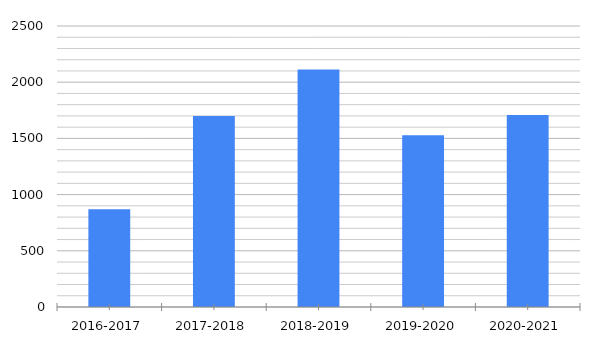
| Category | Кол-во жителей Миасса которые стали клиентами Райдер |
|---|---|
| 2016-2017 | 870 |
| 2017-2018 | 1700 |
| 2018-2019 | 2113 |
| 2019-2020 | 1527 |
| 2020-2021 | 1708 |